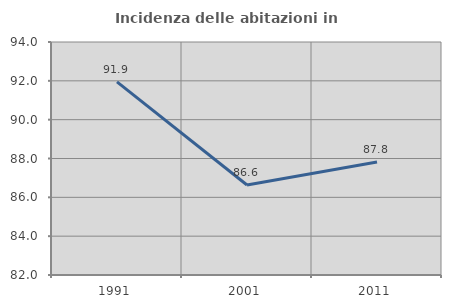
| Category | Incidenza delle abitazioni in proprietà  |
|---|---|
| 1991.0 | 91.943 |
| 2001.0 | 86.636 |
| 2011.0 | 87.815 |